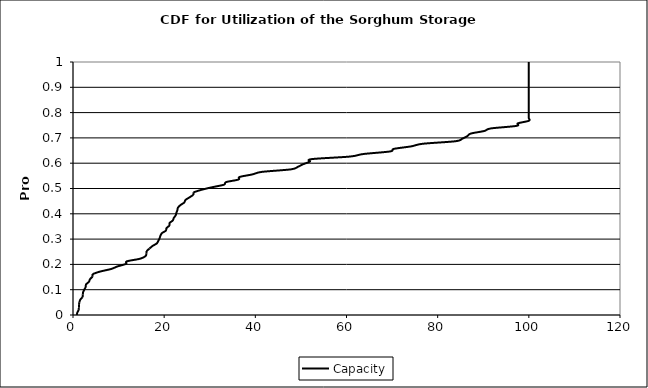
| Category | Capacity |
|---|---|
| 0.8289548197509113 | 0 |
| 0.9571052454469595 | 0.01 |
| 1.267548376650516 | 0.02 |
| 1.2972450684219201 | 0.03 |
| 1.2997465591650967 | 0.04 |
| 1.3939779384394149 | 0.051 |
| 1.5990738329308474 | 0.061 |
| 2.1054058663725246 | 0.071 |
| 2.1490454442667515 | 0.081 |
| 2.232570535187122 | 0.091 |
| 2.5118345744100012 | 0.101 |
| 2.781118890240706 | 0.111 |
| 2.8723492920574483 | 0.121 |
| 3.494585489599443 | 0.131 |
| 3.7224419903588615 | 0.141 |
| 4.2895277699940015 | 0.152 |
| 4.296767398569169 | 0.162 |
| 5.932409633162543 | 0.172 |
| 8.364511611933608 | 0.182 |
| 9.745445870342714 | 0.192 |
| 11.618276532005863 | 0.202 |
| 11.819338696090067 | 0.212 |
| 14.678014994743972 | 0.222 |
| 15.8926131129674 | 0.232 |
| 16.110036577657507 | 0.242 |
| 16.13426787329305 | 0.253 |
| 16.776783664385796 | 0.263 |
| 17.43922255563783 | 0.273 |
| 18.37004908034928 | 0.283 |
| 18.712690757364307 | 0.293 |
| 18.990937379901013 | 0.303 |
| 19.17945388505394 | 0.313 |
| 19.487251122083187 | 0.323 |
| 20.36359910937432 | 0.333 |
| 20.520591849146523 | 0.343 |
| 21.129290546509104 | 0.354 |
| 21.189090205120355 | 0.364 |
| 21.89983508972404 | 0.374 |
| 22.118684908309728 | 0.384 |
| 22.529552013243368 | 0.394 |
| 22.682413247474166 | 0.404 |
| 22.896130898429327 | 0.414 |
| 23.022327939629665 | 0.424 |
| 23.559496909151793 | 0.434 |
| 24.397205284204944 | 0.444 |
| 24.673196281958848 | 0.455 |
| 25.527677386688595 | 0.465 |
| 26.40757582536936 | 0.475 |
| 26.43364200193259 | 0.485 |
| 28.2008513623577 | 0.495 |
| 30.53353137777571 | 0.505 |
| 33.13966132903737 | 0.515 |
| 33.57274318642048 | 0.525 |
| 36.285183446805966 | 0.535 |
| 36.53207464053874 | 0.545 |
| 39.32165308496685 | 0.556 |
| 41.42528825861156 | 0.566 |
| 47.84644947519802 | 0.576 |
| 49.362624986185935 | 0.586 |
| 50.49245514803409 | 0.596 |
| 51.94936226619499 | 0.606 |
| 52.370007144001896 | 0.616 |
| 60.76680692216655 | 0.626 |
| 63.72333630721777 | 0.636 |
| 69.56179782045602 | 0.646 |
| 70.39761240558389 | 0.657 |
| 74.22668696729802 | 0.667 |
| 76.70774383083058 | 0.677 |
| 83.9298107546577 | 0.687 |
| 85.41366978380648 | 0.697 |
| 86.50463605823788 | 0.707 |
| 87.27036493435637 | 0.717 |
| 90.21736064398263 | 0.727 |
| 91.64839744360206 | 0.737 |
| 97.28147092150718 | 0.747 |
| 97.59891094921336 | 0.758 |
| 100.0 | 0.768 |
| 100.0 | 0.778 |
| 100.0 | 0.788 |
| 100.0 | 0.798 |
| 100.0 | 0.808 |
| 100.0 | 0.818 |
| 100.0 | 0.828 |
| 100.0 | 0.838 |
| 100.0 | 0.848 |
| 100.0 | 0.859 |
| 100.0 | 0.869 |
| 100.0 | 0.879 |
| 100.0 | 0.889 |
| 100.0 | 0.899 |
| 100.0 | 0.909 |
| 100.0 | 0.919 |
| 100.0 | 0.929 |
| 100.0 | 0.939 |
| 100.0 | 0.949 |
| 100.0 | 0.96 |
| 100.0 | 0.97 |
| 100.0 | 0.98 |
| 100.0 | 0.99 |
| 100.0 | 1 |